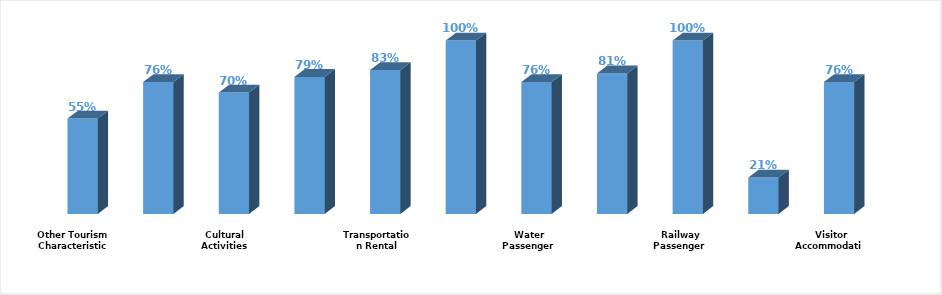
| Category | Series 0 |
|---|---|
|  Visitor Accommodation | 0.76 |
| Food and Beverage | 0.21 |
|  Railway Passenger Transport | 1 |
|  Land Passenger Transport | 0.81 |
|  Water Passenger Transport | 0.76 |
|  Air Passenger Transport | 1 |
|  Transportation Rental | 0.83 |
|   Travel Agencies and Reservation Services  | 0.79 |
| Cultural Activities | 0.7 |
| Sports and Recreational Activities | 0.76 |
| Other Tourism Characteristic Services  | 0.55 |